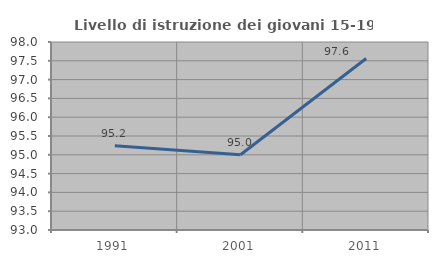
| Category | Livello di istruzione dei giovani 15-19 anni |
|---|---|
| 1991.0 | 95.238 |
| 2001.0 | 95 |
| 2011.0 | 97.561 |